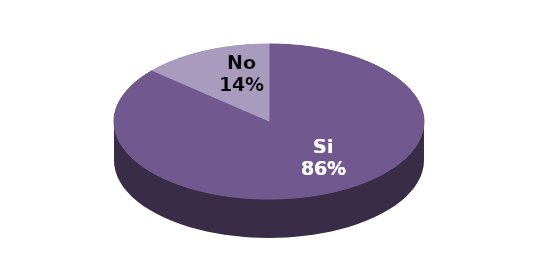
| Category | Series 1 |
|---|---|
| Si | 19 |
| No | 3 |